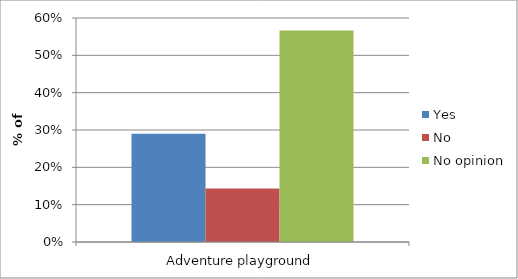
| Category | Yes | No | No opinion |
|---|---|---|---|
| Adventure playground | 0.29 | 0.143 | 0.567 |